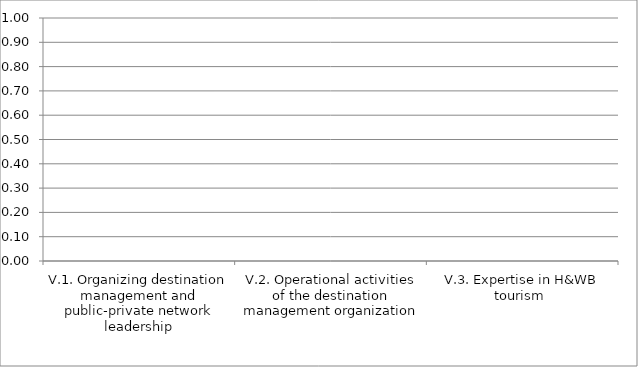
| Category | Series 0 |
|---|---|
| V.1. Organizing destination management and public-private network leadership | 0 |
| V.2. Operational activities of the destination management organization | 0 |
| V.3. Expertise in H&WB tourism  | 0 |